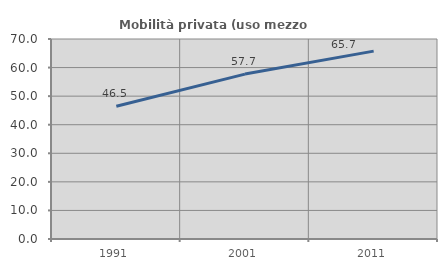
| Category | Mobilità privata (uso mezzo privato) |
|---|---|
| 1991.0 | 46.461 |
| 2001.0 | 57.719 |
| 2011.0 | 65.749 |